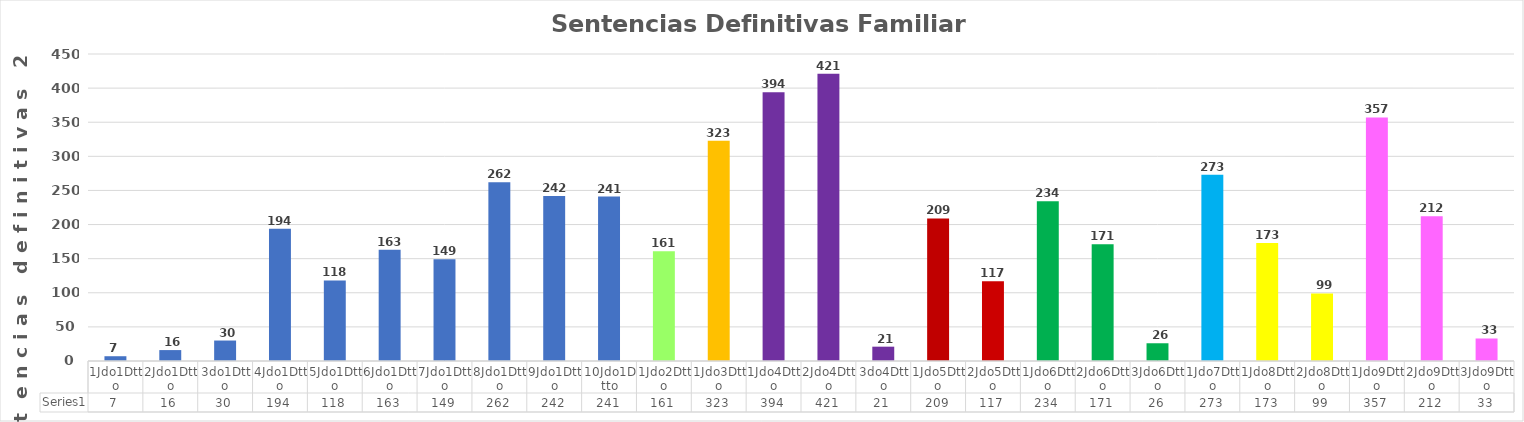
| Category | Series 0 |
|---|---|
| 1Jdo1Dtto | 7 |
| 2Jdo1Dtto | 16 |
| 3do1Dtto | 30 |
| 4Jdo1Dtto | 194 |
| 5Jdo1Dtto | 118 |
| 6Jdo1Dtto | 163 |
| 7Jdo1Dtto | 149 |
| 8Jdo1Dtto | 262 |
| 9Jdo1Dtto | 242 |
| 10Jdo1Dtto | 241 |
| 1Jdo2Dtto | 161 |
| 1Jdo3Dtto | 323 |
| 1Jdo4Dtto | 394 |
| 2Jdo4Dtto | 421 |
| 3do4Dtto | 21 |
| 1Jdo5Dtto | 209 |
| 2Jdo5Dtto | 117 |
| 1Jdo6Dtto | 234 |
| 2Jdo6Dtto | 171 |
| 3Jdo6Dtto | 26 |
| 1Jdo7Dtto | 273 |
| 1Jdo8Dtto | 173 |
| 2Jdo8Dtto | 99 |
| 1Jdo9Dtto | 357 |
| 2Jdo9Dtto | 212 |
| 3Jdo9Dtto | 33 |